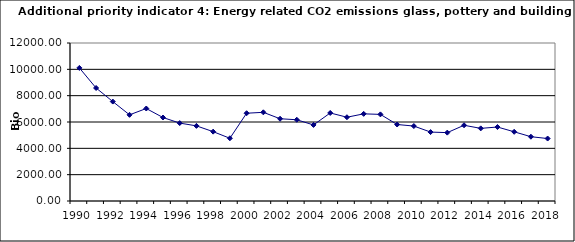
| Category | Energy related CO2 emissions glass, pottery and building materials, kt |
|---|---|
| 1990 | 10108.44 |
| 1991 | 8583.124 |
| 1992 | 7551.407 |
| 1993 | 6543.64 |
| 1994 | 7025.141 |
| 1995 | 6340.17 |
| 1996 | 5917.992 |
| 1997 | 5705.765 |
| 1998 | 5266.848 |
| 1999 | 4764.337 |
| 2000 | 6666.702 |
| 2001 | 6735.554 |
| 2002 | 6247.32 |
| 2003 | 6170.437 |
| 2004 | 5776.241 |
| 2005 | 6686.141 |
| 2006 | 6362.72 |
| 2007 | 6619.259 |
| 2008 | 6577.977 |
| 2009 | 5810.031 |
| 2010 | 5691.46 |
| 2011 | 5235.006 |
| 2012 | 5192.337 |
| 2013 | 5751.87 |
| 2014 | 5516.606 |
| 2015 | 5618.409 |
| 2016 | 5254.846 |
| 2017 | 4883.015 |
| 2018 | 4744.098 |